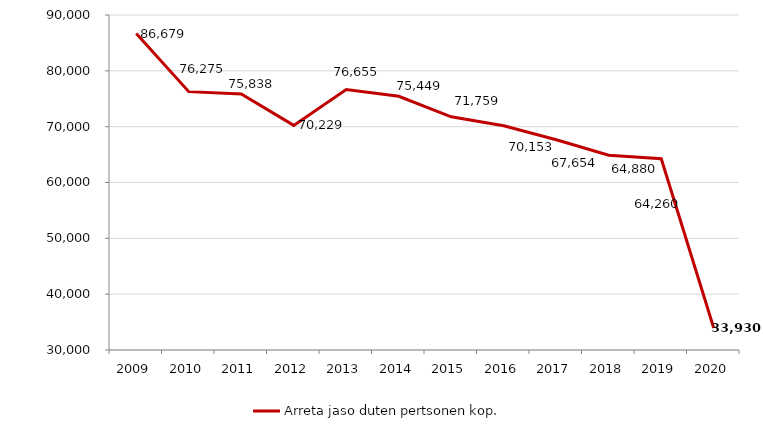
| Category | Arreta jaso duten pertsonen kop. |
|---|---|
| 2009.0 | 86679 |
| 2010.0 | 76275 |
| 2011.0 | 75838 |
| 2012.0 | 70229 |
| 2013.0 | 76655 |
| 2014.0 | 75449 |
| 2015.0 | 71759 |
| 2016.0 | 70153 |
| 2017.0 | 67654 |
| 2018.0 | 64880 |
| 2019.0 | 64260 |
| 2020.0 | 33930 |